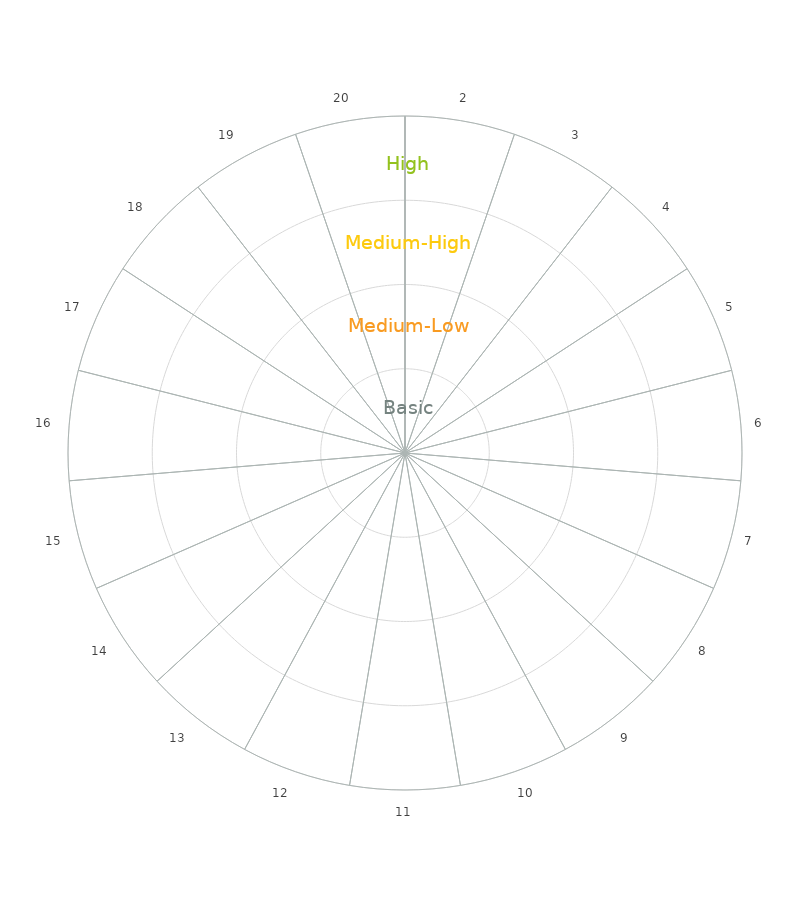
| Category | Sector Weight |
|---|---|
| KPI 0  | 0 |
| KPI 1 | 1 |
| KPI 2 | 1 |
| KPI 3 | 1 |
| KPI 4 | 1 |
| KPI 5 | 1 |
| KPI 6 | 1 |
| KPI 7 | 1 |
| KPI 8 | 1 |
| KPI 9 | 1 |
| KPI 10 | 1 |
| KPI 11 | 1 |
| KPI 12 | 1 |
| KPI 13 | 1 |
| KPI 14 | 1 |
| KPI 15 | 1 |
| KPI 16 | 1 |
| KPI 17 | 1 |
| KPI 18 | 1 |
| KPI 19 | 1 |